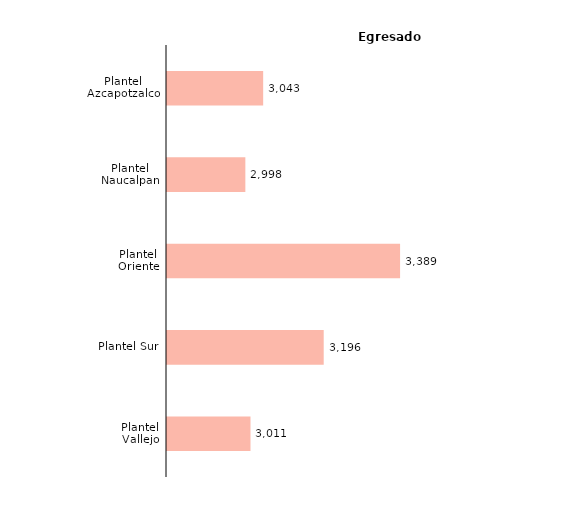
| Category | Series 0 |
|---|---|
| Plantel Vallejo | 3011 |
| Plantel Sur | 3196 |
| Plantel Oriente | 3389 |
| Plantel Naucalpan | 2998 |
| Plantel Azcapotzalco | 3043 |